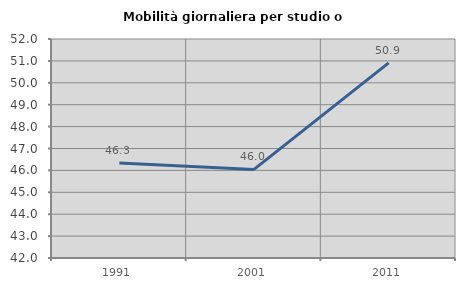
| Category | Mobilità giornaliera per studio o lavoro |
|---|---|
| 1991.0 | 46.343 |
| 2001.0 | 46.045 |
| 2011.0 | 50.913 |